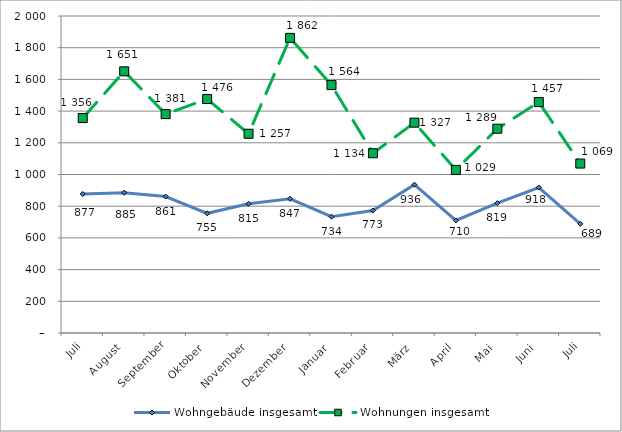
| Category | Wohngebäude insgesamt | Wohnungen insgesamt |
|---|---|---|
| Juli | 877 | 1356 |
| August | 885 | 1651 |
| September | 861 | 1381 |
| Oktober | 755 | 1476 |
| November | 815 | 1257 |
| Dezember | 847 | 1862 |
| Januar | 734 | 1564 |
| Februar | 773 | 1134 |
| März | 936 | 1327 |
| April | 710 | 1029 |
| Mai | 819 | 1289 |
| Juni | 918 | 1457 |
| Juli | 689 | 1069 |